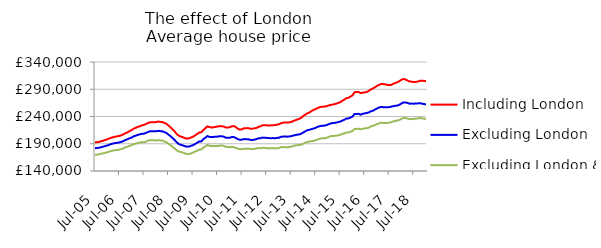
| Category | Including London | Excluding London | Excluding London & SE |
|---|---|---|---|
| 2005-07-01 | 192637.159 | 181907.72 | 169795.831 |
| 2005-08-01 | 192884.354 | 182204.23 | 169987.184 |
| 2005-09-01 | 193456.443 | 182742.056 | 170702.858 |
| 2005-10-01 | 194586.143 | 183737.129 | 171701.029 |
| 2005-11-01 | 195531.81 | 184532.419 | 172389.265 |
| 2005-12-01 | 197150.584 | 185848.339 | 173484.345 |
| 2006-01-01 | 198153.754 | 186784.385 | 174234.386 |
| 2006-02-01 | 199813.466 | 188293.933 | 175667.543 |
| 2006-03-01 | 200983.99 | 189563.153 | 176864.263 |
| 2006-04-01 | 202245.961 | 190631.185 | 177763.943 |
| 2006-05-01 | 203065.042 | 191320.143 | 178237.47 |
| 2006-06-01 | 203685.673 | 191766.348 | 178667.182 |
| 2006-07-01 | 204559.278 | 192518.713 | 179240.302 |
| 2006-08-01 | 205714.078 | 193584.707 | 180374.517 |
| 2006-09-01 | 207431.746 | 195106.329 | 181749.008 |
| 2006-10-01 | 209492.23 | 197111.646 | 183707.283 |
| 2006-11-01 | 211163.513 | 198406.834 | 184803.513 |
| 2006-12-01 | 213373.811 | 200184.26 | 186416.618 |
| 2007-01-01 | 215210.655 | 201535.877 | 187495.779 |
| 2007-02-01 | 217819.553 | 203758.447 | 189382.285 |
| 2007-03-01 | 219232.983 | 204906.873 | 190190.222 |
| 2007-04-01 | 221043.784 | 206461.247 | 191479.848 |
| 2007-05-01 | 222128.218 | 207210.749 | 192197.244 |
| 2007-06-01 | 223865.002 | 208372.622 | 192900.311 |
| 2007-07-01 | 224582.145 | 208580.061 | 193035.973 |
| 2007-08-01 | 226402.251 | 210003.659 | 194051.294 |
| 2007-09-01 | 228182.408 | 211660.89 | 195600.841 |
| 2007-10-01 | 229491.543 | 212979.597 | 196744.628 |
| 2007-11-01 | 229231.088 | 212815.295 | 196339.408 |
| 2007-12-01 | 229404.46 | 212905.332 | 196268.186 |
| 2008-01-01 | 229854.007 | 213027.6 | 195912.124 |
| 2008-02-01 | 230778.597 | 213705.985 | 196694.794 |
| 2008-03-01 | 230153.08 | 213164.837 | 196101.029 |
| 2008-04-01 | 229721.005 | 212737.65 | 195822.963 |
| 2008-05-01 | 228299.829 | 211346.238 | 194168.374 |
| 2008-06-01 | 226513.482 | 209628.718 | 192662.12 |
| 2008-07-01 | 223227.056 | 206570.363 | 189831.839 |
| 2008-08-01 | 220141.088 | 203679.753 | 187225.176 |
| 2008-09-01 | 216463.272 | 200406.398 | 184122.693 |
| 2008-10-01 | 212510.657 | 196770.87 | 181148.64 |
| 2008-11-01 | 207922.628 | 192723.223 | 178029.517 |
| 2008-12-01 | 204675.242 | 189438.674 | 175758.498 |
| 2009-01-01 | 203165.33 | 188120.612 | 174922.017 |
| 2009-02-01 | 201911.844 | 186937.237 | 173762.452 |
| 2009-03-01 | 200225.813 | 185488.87 | 172349.467 |
| 2009-04-01 | 199383.576 | 184697.341 | 171110.985 |
| 2009-05-01 | 199859.253 | 184756.733 | 171205.109 |
| 2009-06-01 | 201412.925 | 186174.835 | 172334.989 |
| 2009-07-01 | 203027.61 | 187480.446 | 173713.12 |
| 2009-08-01 | 205323.71 | 189670.327 | 175544.14 |
| 2009-09-01 | 208069.093 | 191780.428 | 177250.424 |
| 2009-10-01 | 210492.42 | 194114.663 | 179195.013 |
| 2009-11-01 | 210907.6 | 194343.802 | 179474.947 |
| 2009-12-01 | 215086.622 | 198299.021 | 182879.128 |
| 2010-01-01 | 218354.797 | 201001.848 | 185163.534 |
| 2010-02-01 | 222015.55 | 204057.089 | 187708.694 |
| 2010-03-01 | 220623.663 | 202645.504 | 186217.211 |
| 2010-04-01 | 219905.901 | 202176.286 | 185722.593 |
| 2010-05-01 | 220113.626 | 202560.477 | 185660.627 |
| 2010-06-01 | 220921.717 | 202881.827 | 185810.225 |
| 2010-07-01 | 221564.916 | 203122.974 | 185746.775 |
| 2010-08-01 | 222318.029 | 203658.874 | 186337.462 |
| 2010-09-01 | 222269.425 | 203857.033 | 186786.545 |
| 2010-10-01 | 221434.684 | 202970.552 | 186021.486 |
| 2010-11-01 | 219854.924 | 201144.854 | 184354.861 |
| 2010-12-01 | 219866.03 | 200772.354 | 183953.951 |
| 2011-01-01 | 220405.999 | 201085.753 | 183724.506 |
| 2011-02-01 | 222145.885 | 202302.374 | 184279.405 |
| 2011-03-01 | 222431.145 | 202224.902 | 183521.52 |
| 2011-04-01 | 220277.333 | 200405.646 | 182499.86 |
| 2011-05-01 | 217364.071 | 198328.18 | 180845.101 |
| 2011-06-01 | 215781.529 | 197203.528 | 180025.16 |
| 2011-07-01 | 216886.961 | 197679.846 | 180204.195 |
| 2011-08-01 | 218462.386 | 198609.764 | 180911.764 |
| 2011-09-01 | 218447.96 | 198336.118 | 180896.336 |
| 2011-10-01 | 218746.451 | 198390.032 | 181179.074 |
| 2011-11-01 | 217505.539 | 197130.138 | 180183.324 |
| 2011-12-01 | 217590.911 | 196985.648 | 180310.287 |
| 2012-01-01 | 218300.924 | 197626.217 | 180700.792 |
| 2012-02-01 | 219064.04 | 198509.293 | 181516.234 |
| 2012-03-01 | 220982.893 | 200008.532 | 182063.76 |
| 2012-04-01 | 221888.073 | 200155.168 | 181813.842 |
| 2012-05-01 | 224080.255 | 201265.513 | 182442.614 |
| 2012-06-01 | 224094.767 | 201103.147 | 182450.163 |
| 2012-07-01 | 223904.739 | 200785.472 | 181887.565 |
| 2012-08-01 | 223391.425 | 200470.454 | 181782.505 |
| 2012-09-01 | 223676.621 | 200097.203 | 181530.42 |
| 2012-10-01 | 224076.65 | 200441.649 | 182155.422 |
| 2012-11-01 | 224222.02 | 199942.059 | 181394.869 |
| 2012-12-01 | 224932.069 | 200752.198 | 181819.304 |
| 2013-01-01 | 225725.691 | 200982.997 | 181992.077 |
| 2013-02-01 | 227657.684 | 202887.461 | 183982.638 |
| 2013-03-01 | 228536.318 | 203048.201 | 183714.128 |
| 2013-04-01 | 229161.736 | 203446.577 | 184041.738 |
| 2013-05-01 | 228933.746 | 202978.692 | 183179.668 |
| 2013-06-01 | 229215.618 | 203313.988 | 184002.652 |
| 2013-07-01 | 230067.874 | 204001.956 | 184567.567 |
| 2013-08-01 | 231582.352 | 204974.592 | 185829.063 |
| 2013-09-01 | 233071.269 | 205820.443 | 186816.952 |
| 2013-10-01 | 234544.706 | 206712.595 | 187392.956 |
| 2013-11-01 | 235649.654 | 207108.713 | 187518.32 |
| 2013-12-01 | 237829.132 | 208690.471 | 188380.852 |
| 2014-01-01 | 241172.518 | 210845.071 | 190258.481 |
| 2014-02-01 | 243555.901 | 212961.021 | 191924.926 |
| 2014-03-01 | 246091.044 | 214920.699 | 193529.609 |
| 2014-04-01 | 247497.872 | 215742.692 | 194071.52 |
| 2014-05-01 | 250020.497 | 216873.39 | 194767.88 |
| 2014-06-01 | 252131.969 | 217799.223 | 195254.109 |
| 2014-07-01 | 253728.94 | 219290.342 | 196257.739 |
| 2014-08-01 | 255600.623 | 221085.588 | 198018.95 |
| 2014-09-01 | 257111.229 | 222135.43 | 199079.718 |
| 2014-10-01 | 258073.581 | 223029.625 | 200160.045 |
| 2014-11-01 | 258087.083 | 223011.964 | 199843.07 |
| 2014-12-01 | 258355.146 | 223877.078 | 200718.802 |
| 2015-01-01 | 259818.582 | 225210.893 | 201785.11 |
| 2015-02-01 | 261058.597 | 226814.296 | 203490.572 |
| 2015-03-01 | 261701.1 | 227767.121 | 204141.593 |
| 2015-04-01 | 262401.663 | 228109.591 | 204365.531 |
| 2015-05-01 | 263522.572 | 228848.656 | 204714.335 |
| 2015-06-01 | 265038.057 | 229662.855 | 205471.122 |
| 2015-07-01 | 266149.558 | 230709.975 | 206333.662 |
| 2015-08-01 | 268751.273 | 232422.039 | 208026.359 |
| 2015-09-01 | 270772.804 | 233951.289 | 209022.454 |
| 2015-10-01 | 273642.208 | 236127.485 | 210714.392 |
| 2015-11-01 | 274283.861 | 236389.602 | 210643.36 |
| 2015-12-01 | 276419.926 | 238068.942 | 212021.052 |
| 2016-01-01 | 278666.894 | 239684.952 | 213316.584 |
| 2016-02-01 | 284429.326 | 244573.995 | 217105.031 |
| 2016-03-01 | 284960.108 | 244731.444 | 217261.044 |
| 2016-04-01 | 284944.646 | 244897.165 | 217499.971 |
| 2016-05-01 | 282948.008 | 243398.657 | 216367.949 |
| 2016-06-01 | 283814.098 | 244972.216 | 217645.462 |
| 2016-07-01 | 284190.963 | 245619.864 | 217954.862 |
| 2016-08-01 | 285049.367 | 246455.532 | 218604.261 |
| 2016-09-01 | 286912.583 | 247394.501 | 219476.719 |
| 2016-10-01 | 289670.712 | 249511.292 | 221752.508 |
| 2016-11-01 | 291498.925 | 250634.807 | 222803.879 |
| 2016-12-01 | 293660.7 | 252657.472 | 224428.024 |
| 2017-01-01 | 296049.21 | 254650.153 | 225837.11 |
| 2017-02-01 | 297926.736 | 256465.62 | 227397.446 |
| 2017-03-01 | 299530.686 | 257558.871 | 228485.732 |
| 2017-04-01 | 299443.554 | 257192.902 | 228205.941 |
| 2017-05-01 | 299198.045 | 257183.46 | 228299.93 |
| 2017-06-01 | 297889.012 | 256813.656 | 228200.115 |
| 2017-07-01 | 297586.573 | 257234.167 | 228723.006 |
| 2017-08-01 | 297952.018 | 258014.509 | 229628.834 |
| 2017-09-01 | 299921.147 | 258949.663 | 230830.374 |
| 2017-10-01 | 301478 | 259691.149 | 231965.908 |
| 2017-11-01 | 302835.922 | 260069.88 | 232612.243 |
| 2017-12-01 | 304972.766 | 261606.675 | 233807.193 |
| 2018-01-01 | 307457.823 | 263803.223 | 235538.557 |
| 2018-02-01 | 308916.673 | 265919.565 | 237345.217 |
| 2018-03-01 | 307949.622 | 265661.677 | 237037.097 |
| 2018-04-01 | 305866.154 | 264952.686 | 236233.647 |
| 2018-05-01 | 304349.104 | 263476.199 | 234995.753 |
| 2018-06-01 | 303858.588 | 263894.434 | 235654.549 |
| 2018-07-01 | 303058.633 | 263221.349 | 235425.485 |
| 2018-08-01 | 303604.417 | 264121.232 | 236466.195 |
| 2018-09-01 | 303917.53 | 263929.549 | 236414.268 |
| 2018-10-01 | 305760.933 | 264571.434 | 237195.222 |
| 2018-11-01 | 305579.093 | 263616.037 | 236504.652 |
| 2018-12-01 | 305283.604 | 262917.919 | 236079.91 |
| 2019-01-01 | 304739.195 | 262104.947 | 235440.235 |